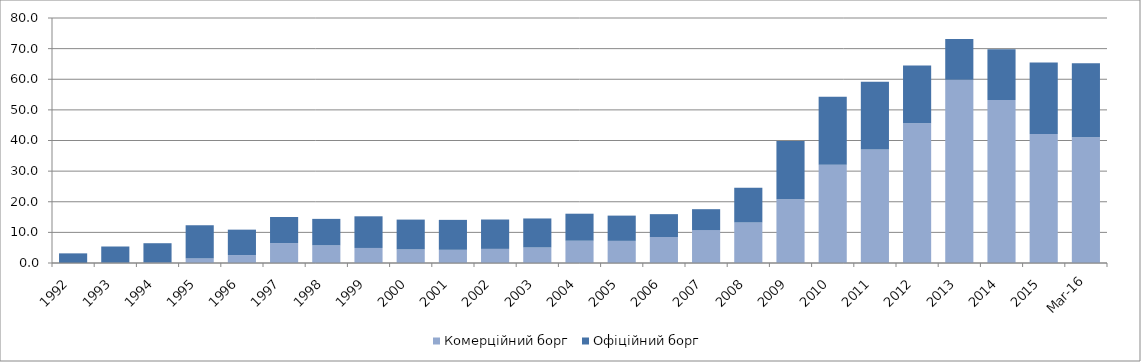
| Category | Комерційний борг | Офіційний борг |
|---|---|---|
| 1992.0 | 0.002 | 3.145 |
| 1993.0 | 0.093 | 5.294 |
| 1994.0 | 0.141 | 6.319 |
| 1995.0 | 1.452 | 10.845 |
| 1996.0 | 2.584 | 8.306 |
| 1997.0 | 6.501 | 8.515 |
| 1998.0 | 5.762 | 8.647 |
| 1999.0 | 4.91 | 10.338 |
| 2000.0 | 4.437 | 9.735 |
| 2001.0 | 4.31 | 9.775 |
| 2002.0 | 4.609 | 9.593 |
| 2003.0 | 5.066 | 9.477 |
| 2004.0 | 7.274 | 8.823 |
| 2005.0 | 7.225 | 8.249 |
| 2006.0 | 8.489 | 7.461 |
| 2007.0 | 10.762 | 6.811 |
| 2008.0 | 13.215 | 11.384 |
| 2009.0 | 20.831 | 18.982 |
| 2010.0 | 32.087 | 22.211 |
| 2011.0 | 37.025 | 22.198 |
| 2012.0 | 45.621 | 18.875 |
| 2013.0 | 59.842 | 13.321 |
| 2014.0 | 53.19 | 16.622 |
| 2015.0 | 42.095 | 23.41 |
| 42460.0 | 41.058 | 24.178 |